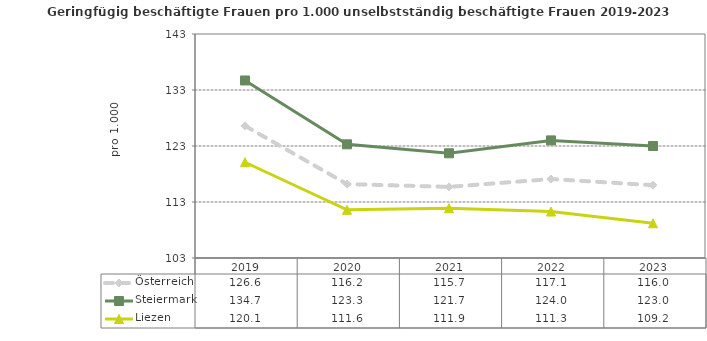
| Category | Österreich | Steiermark | Liezen |
|---|---|---|---|
| 2023.0 | 116 | 123 | 109.2 |
| 2022.0 | 117.1 | 124 | 111.3 |
| 2021.0 | 115.7 | 121.7 | 111.9 |
| 2020.0 | 116.2 | 123.3 | 111.6 |
| 2019.0 | 126.6 | 134.7 | 120.1 |